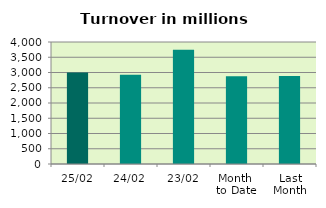
| Category | Series 0 |
|---|---|
| 25/02 | 2998.268 |
| 24/02 | 2928.278 |
| 23/02 | 3744.796 |
| Month 
to Date | 2873.795 |
| Last
Month | 2888.221 |